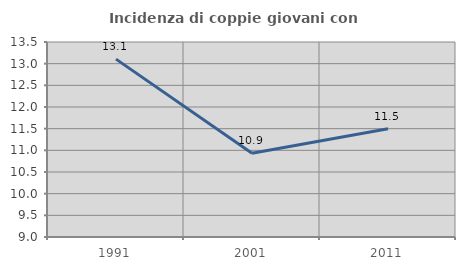
| Category | Incidenza di coppie giovani con figli |
|---|---|
| 1991.0 | 13.105 |
| 2001.0 | 10.933 |
| 2011.0 | 11.498 |